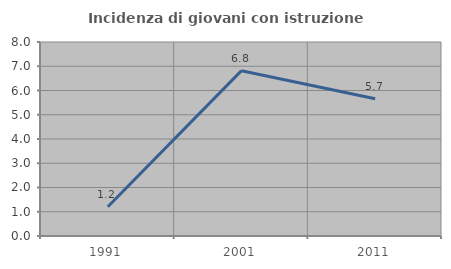
| Category | Incidenza di giovani con istruzione universitaria |
|---|---|
| 1991.0 | 1.205 |
| 2001.0 | 6.818 |
| 2011.0 | 5.66 |